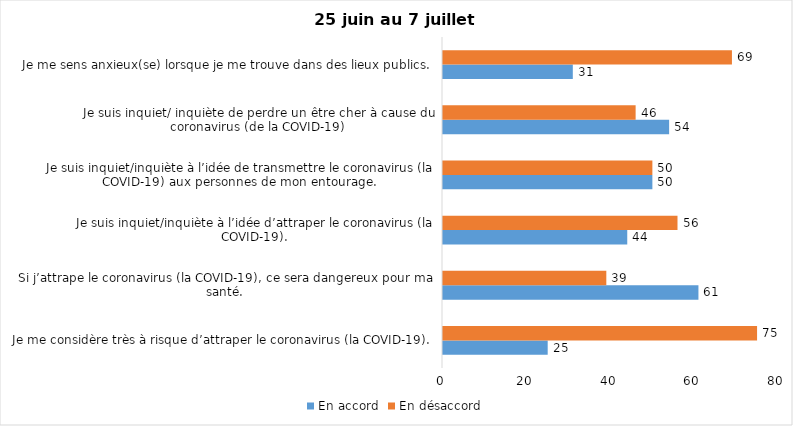
| Category | En accord | En désaccord |
|---|---|---|
| Je me considère très à risque d’attraper le coronavirus (la COVID-19). | 25 | 75 |
| Si j’attrape le coronavirus (la COVID-19), ce sera dangereux pour ma santé. | 61 | 39 |
| Je suis inquiet/inquiète à l’idée d’attraper le coronavirus (la COVID-19). | 44 | 56 |
| Je suis inquiet/inquiète à l’idée de transmettre le coronavirus (la COVID-19) aux personnes de mon entourage. | 50 | 50 |
| Je suis inquiet/ inquiète de perdre un être cher à cause du coronavirus (de la COVID-19) | 54 | 46 |
| Je me sens anxieux(se) lorsque je me trouve dans des lieux publics. | 31 | 69 |